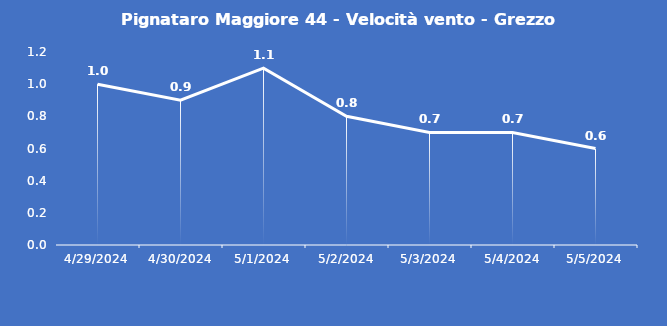
| Category | Pignataro Maggiore 44 - Velocità vento - Grezzo (m/s) |
|---|---|
| 4/29/24 | 1 |
| 4/30/24 | 0.9 |
| 5/1/24 | 1.1 |
| 5/2/24 | 0.8 |
| 5/3/24 | 0.7 |
| 5/4/24 | 0.7 |
| 5/5/24 | 0.6 |